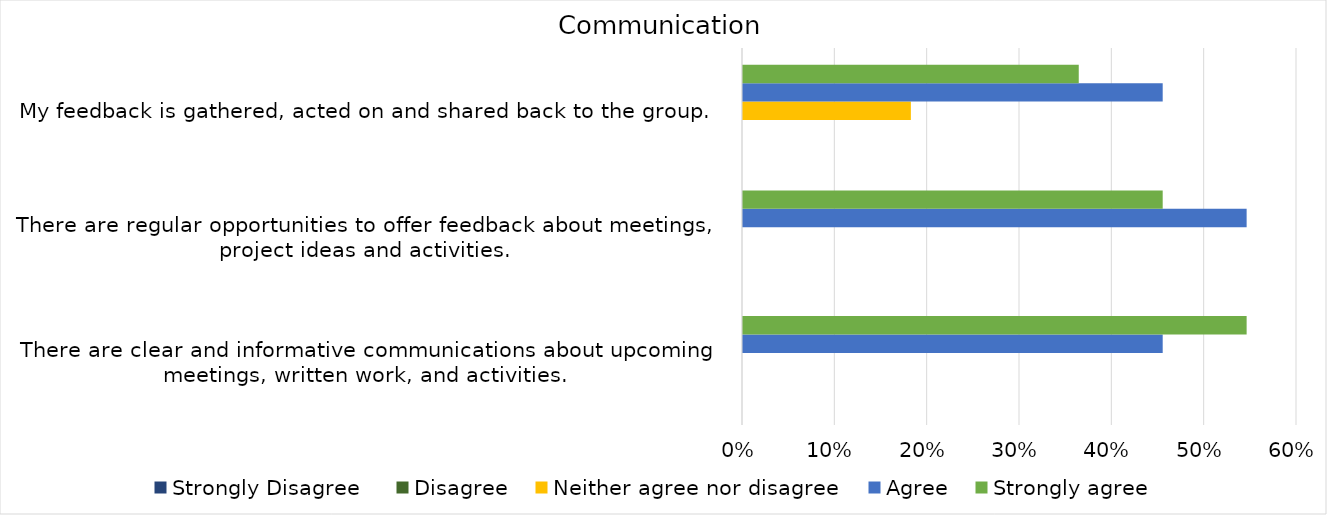
| Category | Strongly Disagree 
 | Disagree
 | Neither agree nor disagree
 | Agree
 | Strongly agree
 |
|---|---|---|---|---|---|
| There are clear and informative communications about upcoming meetings, written work, and activities. 

 | 0 | 0 | 0 | 0.455 | 0.545 |
| There are regular opportunities to offer feedback about meetings, project ideas and activities. 
 | 0 | 0 | 0 | 0.545 | 0.455 |
| My feedback is gathered, acted on and shared back to the group. 
 | 0 | 0 | 0.182 | 0.455 | 0.364 |